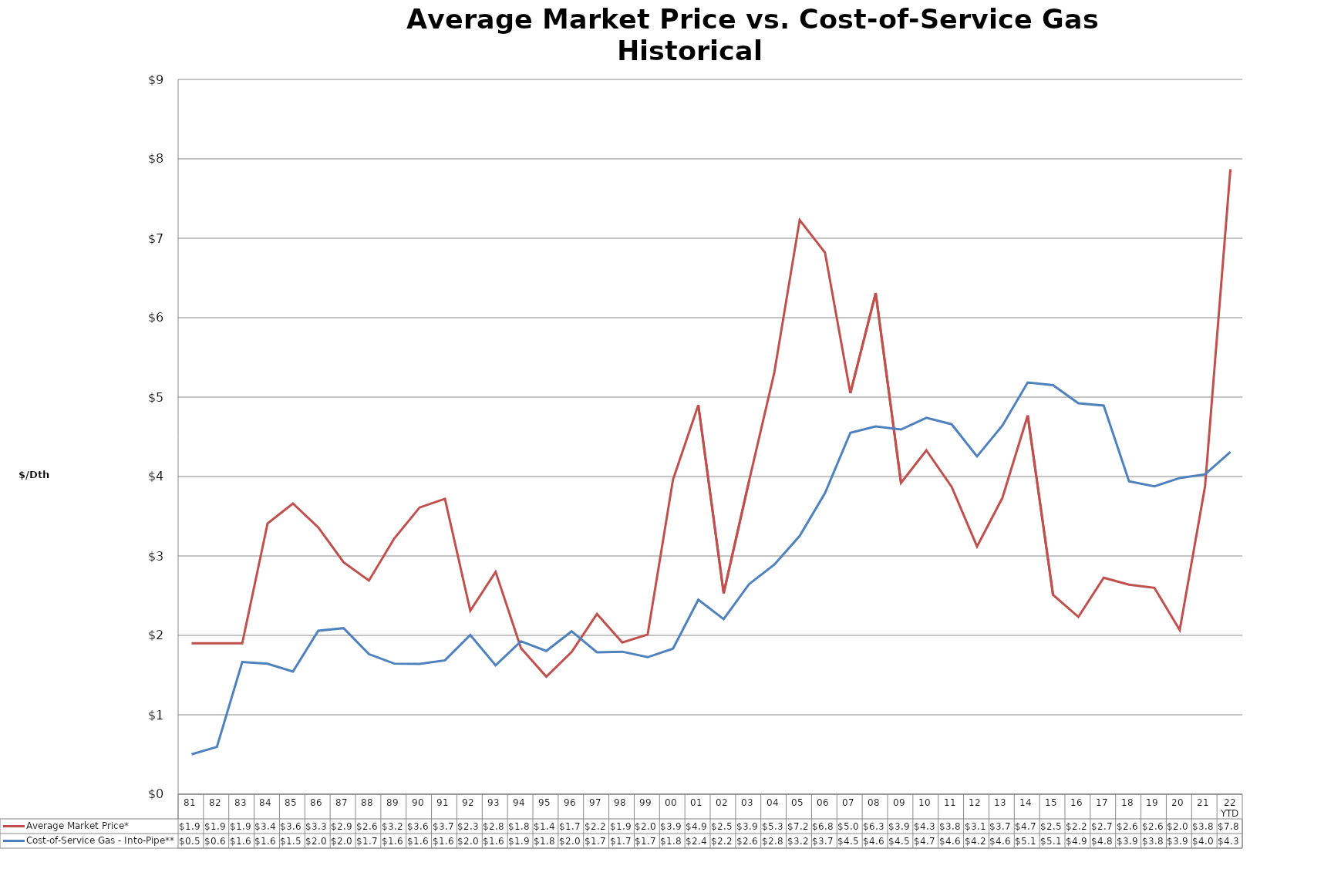
| Category | Average Market Price* | Cost-of-Service Gas - Into-Pipe** |
|---|---|---|
| 81 | 1.9 | 0.502 |
| 82 | 1.9 | 0.596 |
| 83 | 1.9 | 1.665 |
| 84 | 3.41 | 1.643 |
| 85 | 3.66 | 1.543 |
| 86 | 3.36 | 2.059 |
| 87 | 2.92 | 2.091 |
| 88 | 2.69 | 1.764 |
| 89 | 3.22 | 1.644 |
| 90 | 3.61 | 1.642 |
| 91 | 3.72 | 1.685 |
| 92 | 2.31 | 2.005 |
| 93 | 2.8 | 1.623 |
| 94 | 1.84 | 1.926 |
| 95 | 1.48 | 1.804 |
| 96 | 1.79 | 2.052 |
| 97 | 2.27 | 1.787 |
| 98 | 1.91 | 1.795 |
| 99 | 2.01 | 1.725 |
| 00 | 3.96 | 1.833 |
| 01 | 4.9 | 2.448 |
| 02 | 2.53 | 2.204 |
| 03 | 3.94 | 2.644 |
| 04 | 5.31 | 2.891 |
| 05 | 7.23 | 3.251 |
| 06 | 6.82 | 3.792 |
| 07 | 5.05 | 4.551 |
| 08 | 6.31 | 4.632 |
| 09 | 3.92 | 4.592 |
| 10 | 4.33 | 4.74 |
| 11 | 3.87 | 4.658 |
| 12 | 3.12 | 4.253 |
| 13 | 3.73 | 4.641 |
| 14 | 4.77 | 5.184 |
| 15 | 2.51 | 5.151 |
| 16 | 2.233 | 4.923 |
| 17 | 2.725 | 4.894 |
| 18 | 2.639 | 3.94 |
| 19 | 2.599 | 3.877 |
| 20 | 2.067 | 3.981 |
| 21 | 3.879 | 4.027 |
| 22 YTD | 7.87 | 4.308 |